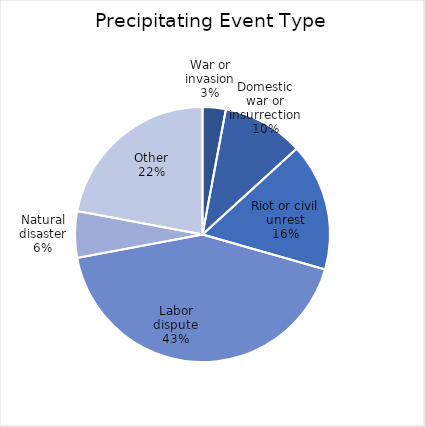
| Category | Series 0 |
|---|---|
| War or invasion | 2 |
| Domestic war or insurrection | 7 |
| Riot or civil unrest | 11 |
| Labor dispute | 29 |
| Natural disaster | 4 |
| Other | 15 |